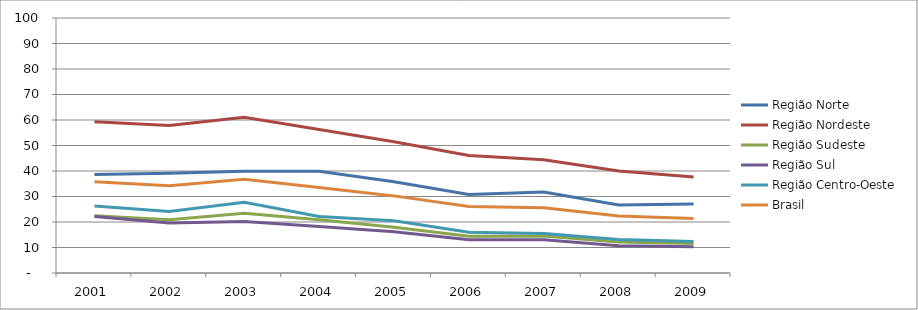
| Category | Região Norte | Região Nordeste | Região Sudeste | Região Sul | Região Centro-Oeste | Brasil |
|---|---|---|---|---|---|---|
| 2001.0 | 38.62 | 59.29 | 22.48 | 22.11 | 26.31 | 35.78 |
| 2002.0 | 39.16 | 57.82 | 20.92 | 19.62 | 24.14 | 34.22 |
| 2003.0 | 39.93 | 61.04 | 23.45 | 20.22 | 27.7 | 36.73 |
| 2004.0 | 39.91 | 56.26 | 20.84 | 18.27 | 22.17 | 33.54 |
| 2005.0 | 35.76 | 51.46 | 17.91 | 16.21 | 20.45 | 30.24 |
| 2006.0 | 30.77 | 46.05 | 14.38 | 13.06 | 15.95 | 26.04 |
| 2007.0 | 31.8 | 44.41 | 14.48 | 13 | 15.49 | 25.62 |
| 2008.0 | 26.71 | 39.96 | 12.17 | 10.67 | 13.17 | 22.39 |
| 2009.0 | 27.08 | 37.67 | 11.57 | 10.34 | 12.31 | 21.4 |